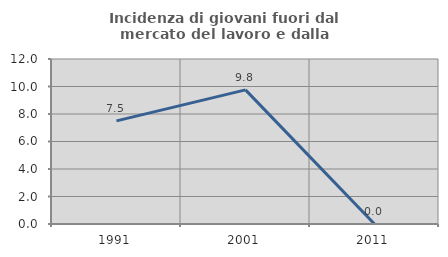
| Category | Incidenza di giovani fuori dal mercato del lavoro e dalla formazione  |
|---|---|
| 1991.0 | 7.5 |
| 2001.0 | 9.756 |
| 2011.0 | 0 |